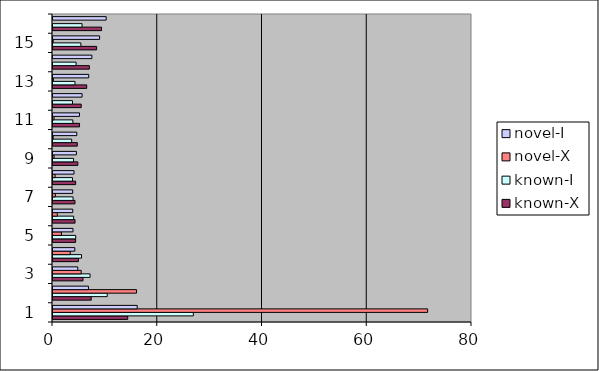
| Category | known-X | known-I | novel-X | novel-I |
|---|---|---|---|---|
| 1.0 | 14.269 | 26.797 | 71.527 | 16.073 |
| 2.0 | 7.302 | 10.353 | 15.952 | 6.768 |
| 3.0 | 5.728 | 7.08 | 5.386 | 4.731 |
| 4.0 | 4.852 | 5.448 | 3.293 | 4.161 |
| 5.0 | 4.316 | 4.333 | 1.612 | 3.81 |
| 6.0 | 4.208 | 3.943 | 0.823 | 3.772 |
| 7.0 | 4.195 | 3.835 | 0.446 | 3.76 |
| 8.0 | 4.32 | 3.726 | 0.412 | 4.017 |
| 9.0 | 4.74 | 3.925 | 0.206 | 4.468 |
| 10.0 | 4.64 | 3.563 | 0.034 | 4.543 |
| 11.0 | 5.068 | 3.789 | 0.206 | 5.063 |
| 12.0 | 5.388 | 3.726 | 0 | 5.552 |
| 13.0 | 6.434 | 4.197 | 0.069 | 6.818 |
| 14.0 | 6.941 | 4.415 | 0 | 7.419 |
| 15.0 | 8.328 | 5.321 | 0.034 | 8.892 |
| 16.0 | 9.271 | 5.548 | 0 | 10.152 |